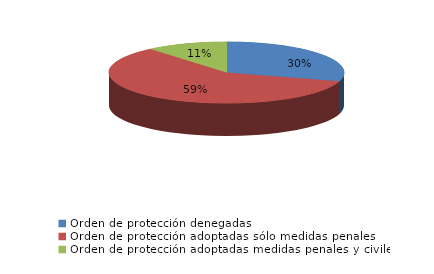
| Category | Series 0 |
|---|---|
| Orden de protección denegadas | 56 |
| Orden de protección adoptadas sólo medidas penales | 112 |
| Orden de protección adoptadas medidas penales y civiles | 21 |